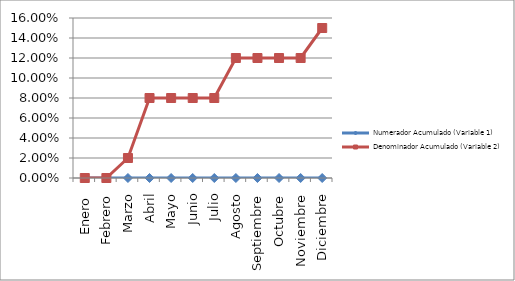
| Category | Numerador Acumulado (Variable 1) | Denominador Acumulado (Variable 2) |
|---|---|---|
| Enero  | 0 | 0 |
| Febrero | 0 | 0 |
| Marzo | 0 | 0.02 |
| Abril | 0 | 0.08 |
| Mayo | 0 | 0.08 |
| Junio | 0 | 0.08 |
| Julio | 0 | 0.08 |
| Agosto | 0 | 0.12 |
| Septiembre | 0 | 0.12 |
| Octubre | 0 | 0.12 |
| Noviembre | 0 | 0.12 |
| Diciembre | 0 | 0.15 |